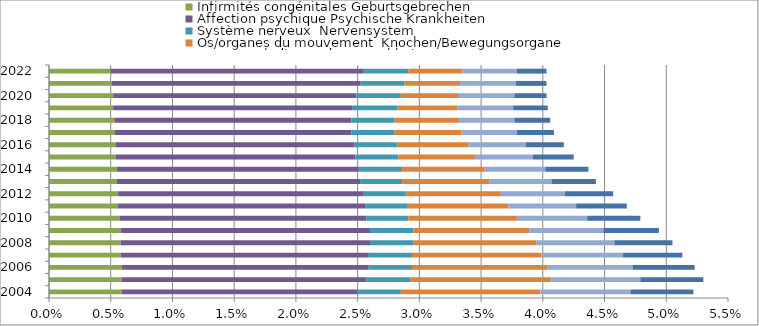
| Category | Infirmités congénitales | Affection psychique | Système nerveux  | Os/organes du mouvement  | Autres maladies | Accident  |
|---|---|---|---|---|---|---|
| 2004.0 | 0.006 | 0.019 | 0.003 | 0.011 | 0.007 | 0.005 |
| 2005.0 | 0.006 | 0.02 | 0.004 | 0.011 | 0.007 | 0.005 |
| 2006.0 | 0.006 | 0.02 | 0.003 | 0.011 | 0.007 | 0.005 |
| 2007.0 | 0.006 | 0.02 | 0.003 | 0.01 | 0.007 | 0.005 |
| 2008.0 | 0.006 | 0.02 | 0.003 | 0.01 | 0.006 | 0.005 |
| 2009.0 | 0.006 | 0.02 | 0.003 | 0.009 | 0.006 | 0.005 |
| 2010.0 | 0.006 | 0.02 | 0.003 | 0.009 | 0.006 | 0.004 |
| 2011.0 | 0.006 | 0.02 | 0.003 | 0.008 | 0.006 | 0.004 |
| 2012.0 | 0.006 | 0.02 | 0.003 | 0.008 | 0.005 | 0.004 |
| 2013.0 | 0.006 | 0.02 | 0.003 | 0.007 | 0.005 | 0.004 |
| 2014.0 | 0.006 | 0.02 | 0.003 | 0.007 | 0.005 | 0.003 |
| 2015.0 | 0.005 | 0.019 | 0.003 | 0.006 | 0.005 | 0.003 |
| 2016.0 | 0.005 | 0.019 | 0.003 | 0.006 | 0.005 | 0.003 |
| 2017.0 | 0.005 | 0.019 | 0.003 | 0.005 | 0.005 | 0.003 |
| 2018.0 | 0.005 | 0.019 | 0.003 | 0.005 | 0.005 | 0.003 |
| 2019.0 | 0.005 | 0.019 | 0.004 | 0.005 | 0.005 | 0.003 |
| 2020.0 | 0.005 | 0.02 | 0.004 | 0.005 | 0.005 | 0.003 |
| 2021.0 | 0.005 | 0.02 | 0.004 | 0.005 | 0.005 | 0.002 |
| 2022.0 | 0.005 | 0.02 | 0.004 | 0.004 | 0.004 | 0.002 |